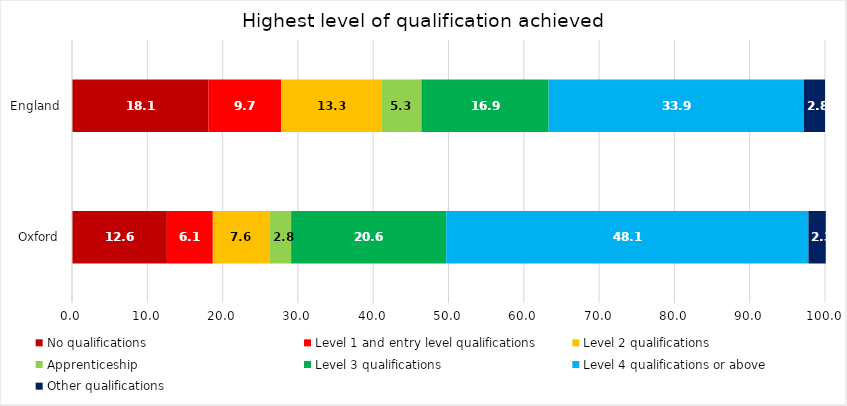
| Category | No qualifications | Level 1 and entry level qualifications | Level 2 qualifications | Apprenticeship | Level 3 qualifications | Level 4 qualifications or above | Other qualifications |
|---|---|---|---|---|---|---|---|
| Oxford | 12.6 | 6.1 | 7.6 | 2.8 | 20.6 | 48.1 | 2.3 |
| England | 18.1 | 9.7 | 13.3 | 5.3 | 16.9 | 33.9 | 2.8 |